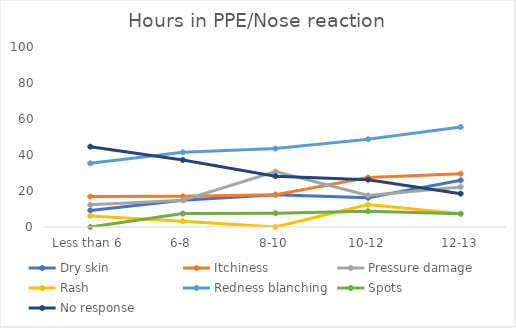
| Category | Dry skin | Itchiness | Pressure damage | Rash | Redness blanching | Spots | No response |
|---|---|---|---|---|---|---|---|
| Less than 6 | 9.231 | 16.923 | 12.308 | 6.154 | 35.385 | 0 | 44.615 |
| 6-8 | 14.894 | 17.021 | 14.894 | 3.191 | 41.489 | 7.447 | 37.234 |
| 8-10 | 17.949 | 17.949 | 30.769 | 0 | 43.59 | 7.692 | 28.205 |
| 10-12 | 16.25 | 27.5 | 17.5 | 12.5 | 48.75 | 8.75 | 26.25 |
| 12-13 | 25.926 | 29.63 | 22.222 | 7.407 | 55.556 | 7.407 | 18.519 |